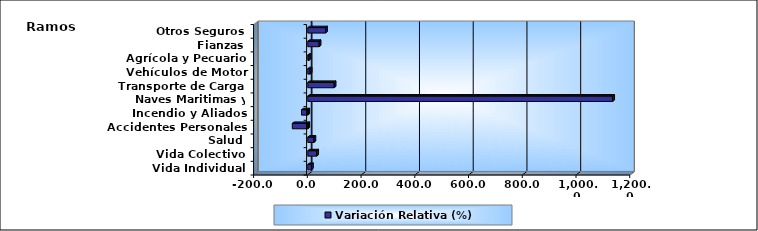
| Category | Variación Relativa (%) |
|---|---|
| Vida Individual | 13.593 |
| Vida Colectivo | 33.127 |
| Salud | 22.86 |
| Accidentes Personales | -57.532 |
| Incendio y Aliados | -23.223 |
| Naves Maritimas y Aéreas | 1134.917 |
| Transporte de Carga | 98.03 |
| Vehículos de Motor | 8.861 |
| Agrícola y Pecuario | 4.38 |
| Fianzas | 42.143 |
| Otros Seguros | 66.06 |